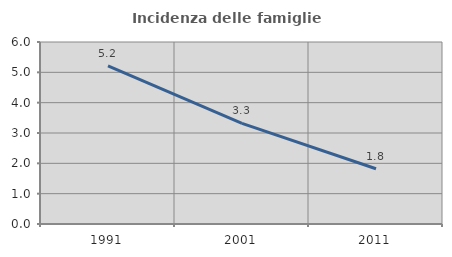
| Category | Incidenza delle famiglie numerose |
|---|---|
| 1991.0 | 5.212 |
| 2001.0 | 3.318 |
| 2011.0 | 1.821 |